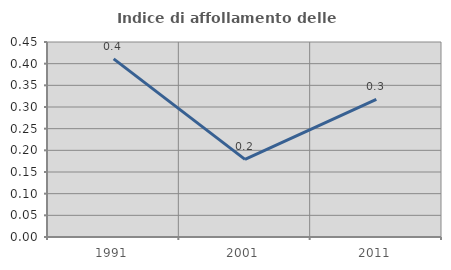
| Category | Indice di affollamento delle abitazioni  |
|---|---|
| 1991.0 | 0.411 |
| 2001.0 | 0.179 |
| 2011.0 | 0.318 |